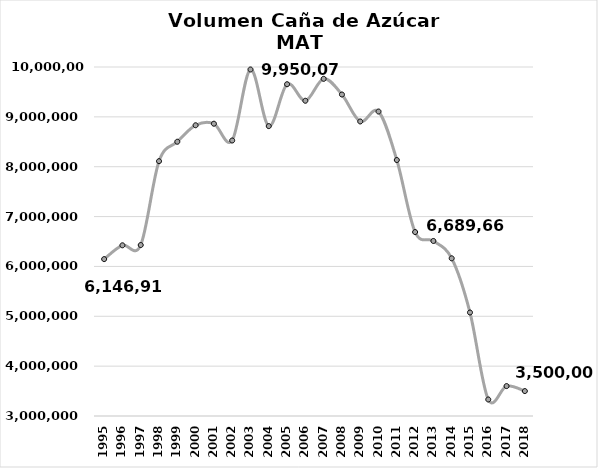
| Category | CAÑA DE AZÚCAR |
|---|---|
| 1995.0 | 6146912 |
| 1996.0 | 6423819 |
| 1997.0 | 6428958 |
| 1998.0 | 8111023 |
| 1999.0 | 8501109 |
| 2000.0 | 8831523 |
| 2001.0 | 8862621 |
| 2002.0 | 8525815 |
| 2003.0 | 9950078 |
| 2004.0 | 8814248 |
| 2005.0 | 9654393 |
| 2006.0 | 9322937 |
| 2007.0 | 9762634 |
| 2008.0 | 9448160 |
| 2009.0 | 8907666 |
| 2010.0 | 9107078 |
| 2011.0 | 8134111 |
| 2012.0 | 6689667 |
| 2013.0 | 6510653 |
| 2014.0 | 6162504 |
| 2015.0 | 5075878 |
| 2016.0 | 3331252 |
| 2017.0 | 3600000 |
| 2018.0 | 3500000 |